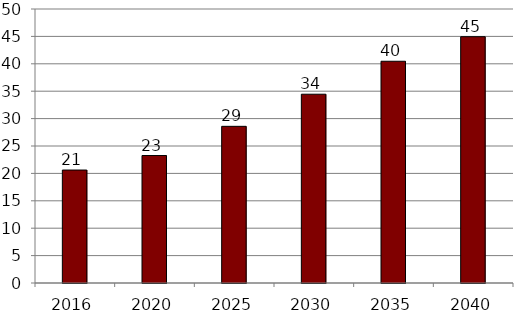
| Category | Series 0 |
|---|---|
| 2016.0 | 20614 |
| 2020.0 | 23262 |
| 2025.0 | 28587 |
| 2030.0 | 34451 |
| 2035.0 | 40465 |
| 2040.0 | 44946 |